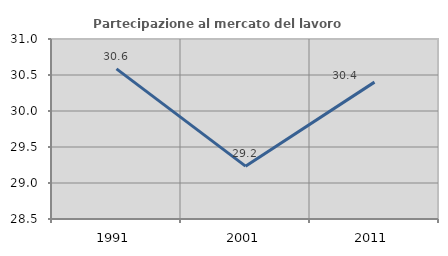
| Category | Partecipazione al mercato del lavoro  femminile |
|---|---|
| 1991.0 | 30.585 |
| 2001.0 | 29.234 |
| 2011.0 | 30.401 |